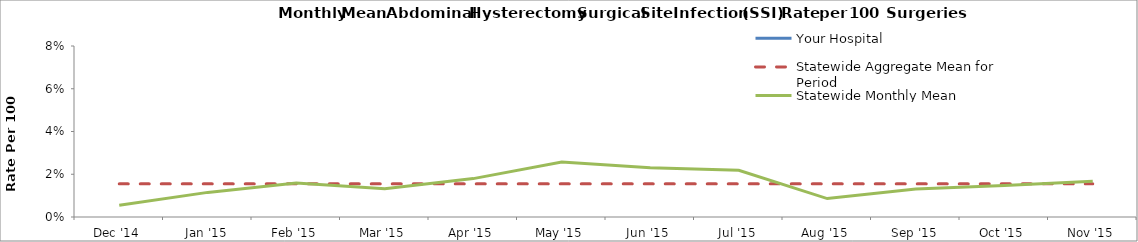
| Category | Your Hospital | Statewide Aggregate Mean for Period | Statewide Monthly Mean |
|---|---|---|---|
| Dec '14 |  | 0.015 | 0.005 |
| Jan '15 |  | 0.015 | 0.012 |
| Feb '15 |  | 0.015 | 0.016 |
| Mar '15 |  | 0.015 | 0.013 |
| Apr '15 |  | 0.015 | 0.018 |
| May '15 |  | 0.015 | 0.026 |
| Jun '15 |  | 0.015 | 0.023 |
| Jul '15 |  | 0.015 | 0.022 |
| Aug '15 |  | 0.015 | 0.009 |
| Sep '15 |  | 0.015 | 0.013 |
| Oct '15 |  | 0.015 | 0.015 |
| Nov '15 |  | 0.015 | 0.017 |